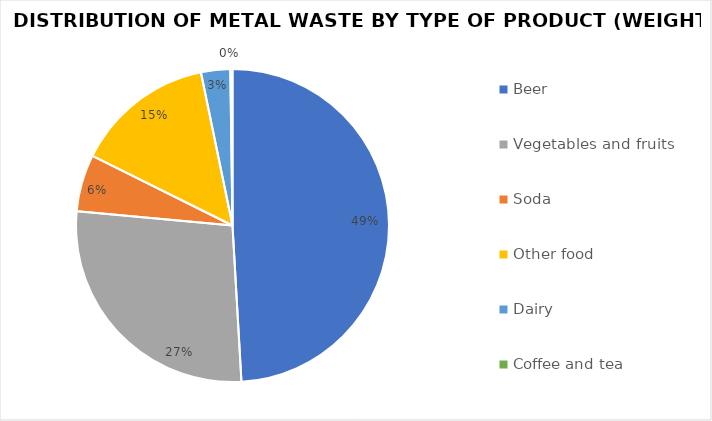
| Category | Series 0 |
|---|---|
| Beer | 19.77 |
| Vegetables and fruits | 11.025 |
| Soda | 2.37 |
| Other food | 5.805 |
| Dairy | 1.215 |
| Coffee and tea | 0.09 |